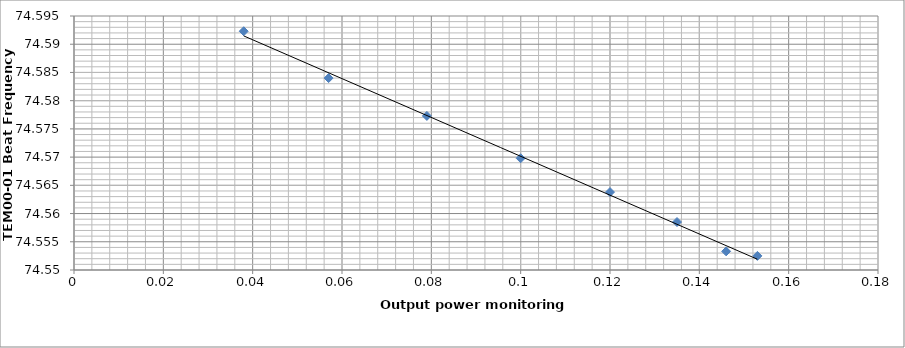
| Category | Series 0 |
|---|---|
| 0.153 | 74.552 |
| 0.146 | 74.553 |
| 0.135 | 74.558 |
| 0.12 | 74.564 |
| 0.1 | 74.57 |
| 0.079 | 74.577 |
| 0.057 | 74.584 |
| 0.038 | 74.592 |